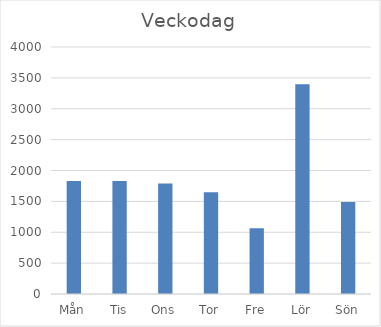
| Category | Summa |
|---|---|
| Mån | 1828 |
| Tis | 1830 |
| Ons | 1788 |
| Tor | 1646 |
| Fre | 1065 |
| Lör | 3396 |
| Sön | 1490 |